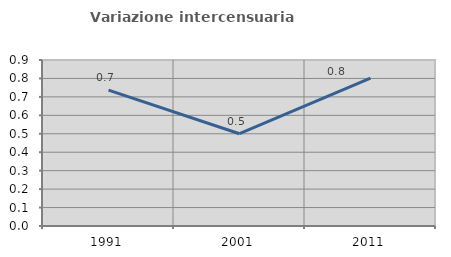
| Category | Variazione intercensuaria annua |
|---|---|
| 1991.0 | 0.737 |
| 2001.0 | 0.5 |
| 2011.0 | 0.801 |